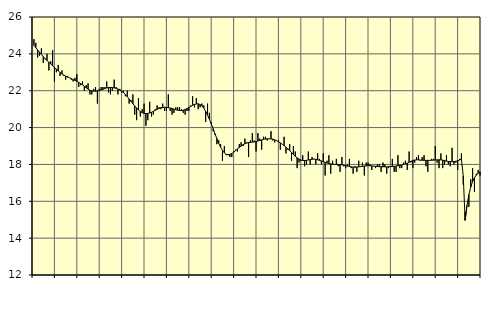
| Category | Tillverkning o utvinning, energi o miljö, SNI 05-33, 35-39 | Series 1 |
|---|---|---|
| nan | 24.8 | 24.46 |
| 1.0 | 24.6 | 24.34 |
| 1.0 | 23.8 | 24.21 |
| 1.0 | 23.9 | 24.09 |
| 1.0 | 24.3 | 23.97 |
| 1.0 | 23.5 | 23.85 |
| 1.0 | 23.7 | 23.74 |
| 1.0 | 24 | 23.64 |
| 1.0 | 23.1 | 23.54 |
| 1.0 | 23.6 | 23.45 |
| 1.0 | 24.2 | 23.35 |
| 1.0 | 22.5 | 23.26 |
| nan | 23 | 23.17 |
| 2.0 | 23.4 | 23.08 |
| 2.0 | 22.8 | 22.99 |
| 2.0 | 23.1 | 22.91 |
| 2.0 | 22.8 | 22.85 |
| 2.0 | 22.6 | 22.79 |
| 2.0 | 22.8 | 22.74 |
| 2.0 | 22.7 | 22.7 |
| 2.0 | 22.6 | 22.66 |
| 2.0 | 22.5 | 22.61 |
| 2.0 | 22.7 | 22.56 |
| 2.0 | 22.9 | 22.51 |
| nan | 22.2 | 22.45 |
| 3.0 | 22.3 | 22.39 |
| 3.0 | 22.5 | 22.32 |
| 3.0 | 22 | 22.24 |
| 3.0 | 22.3 | 22.16 |
| 3.0 | 22.4 | 22.09 |
| 3.0 | 21.8 | 22.03 |
| 3.0 | 21.8 | 21.99 |
| 3.0 | 22.1 | 21.98 |
| 3.0 | 22.2 | 21.97 |
| 3.0 | 21.3 | 21.99 |
| 3.0 | 22.1 | 22.01 |
| nan | 22.2 | 22.05 |
| 4.0 | 22.2 | 22.08 |
| 4.0 | 22.2 | 22.12 |
| 4.0 | 22.5 | 22.15 |
| 4.0 | 21.9 | 22.17 |
| 4.0 | 21.8 | 22.18 |
| 4.0 | 22 | 22.17 |
| 4.0 | 22.6 | 22.15 |
| 4.0 | 22.2 | 22.13 |
| 4.0 | 21.8 | 22.09 |
| 4.0 | 22.1 | 22.04 |
| 4.0 | 21.9 | 21.98 |
| nan | 22 | 21.89 |
| 5.0 | 21.7 | 21.79 |
| 5.0 | 22 | 21.68 |
| 5.0 | 21.3 | 21.55 |
| 5.0 | 21.5 | 21.42 |
| 5.0 | 21.8 | 21.29 |
| 5.0 | 20.7 | 21.17 |
| 5.0 | 20.4 | 21.06 |
| 5.0 | 21.6 | 20.96 |
| 5.0 | 20.6 | 20.87 |
| 5.0 | 21 | 20.81 |
| 5.0 | 21.3 | 20.77 |
| nan | 20.1 | 20.76 |
| 6.0 | 20.4 | 20.77 |
| 6.0 | 21.4 | 20.79 |
| 6.0 | 20.6 | 20.83 |
| 6.0 | 20.7 | 20.88 |
| 6.0 | 21 | 20.94 |
| 6.0 | 21.2 | 20.99 |
| 6.0 | 21.1 | 21.04 |
| 6.0 | 21 | 21.08 |
| 6.0 | 21.3 | 21.09 |
| 6.0 | 20.9 | 21.1 |
| 6.0 | 20.9 | 21.09 |
| nan | 21.8 | 21.08 |
| 7.0 | 20.9 | 21.06 |
| 7.0 | 20.7 | 21.04 |
| 7.0 | 20.8 | 21 |
| 7.0 | 21.1 | 20.97 |
| 7.0 | 21.1 | 20.94 |
| 7.0 | 21.1 | 20.93 |
| 7.0 | 21 | 20.92 |
| 7.0 | 20.8 | 20.94 |
| 7.0 | 20.7 | 20.98 |
| 7.0 | 20.9 | 21.03 |
| 7.0 | 20.9 | 21.09 |
| nan | 21.2 | 21.15 |
| 8.0 | 21.7 | 21.21 |
| 8.0 | 21.1 | 21.25 |
| 8.0 | 21.6 | 21.28 |
| 8.0 | 21 | 21.29 |
| 8.0 | 21.1 | 21.25 |
| 8.0 | 21.3 | 21.17 |
| 8.0 | 21.2 | 21.05 |
| 8.0 | 20.3 | 20.88 |
| 8.0 | 21.3 | 20.68 |
| 8.0 | 20.8 | 20.45 |
| 8.0 | 20.3 | 20.2 |
| nan | 19.8 | 19.94 |
| 9.0 | 19.6 | 19.66 |
| 9.0 | 19.1 | 19.4 |
| 9.0 | 19.3 | 19.15 |
| 9.0 | 19.1 | 18.93 |
| 9.0 | 18.2 | 18.76 |
| 9.0 | 19 | 18.63 |
| 9.0 | 18.5 | 18.55 |
| 9.0 | 18.5 | 18.53 |
| 9.0 | 18.4 | 18.55 |
| 9.0 | 18.4 | 18.59 |
| 9.0 | 18.7 | 18.66 |
| nan | 18.8 | 18.75 |
| 10.0 | 18.7 | 18.84 |
| 10.0 | 19.1 | 18.92 |
| 10.0 | 19.2 | 19 |
| 10.0 | 19 | 19.07 |
| 10.0 | 19.4 | 19.12 |
| 10.0 | 19.2 | 19.16 |
| 10.0 | 18.4 | 19.18 |
| 10.0 | 19.3 | 19.2 |
| 10.0 | 19.7 | 19.21 |
| 10.0 | 19.3 | 19.22 |
| 10.0 | 18.7 | 19.23 |
| nan | 19.7 | 19.27 |
| 11.0 | 19.4 | 19.3 |
| 11.0 | 18.8 | 19.33 |
| 11.0 | 19.5 | 19.36 |
| 11.0 | 19.5 | 19.38 |
| 11.0 | 19.3 | 19.39 |
| 11.0 | 19.4 | 19.39 |
| 11.0 | 19.8 | 19.39 |
| 11.0 | 19.3 | 19.37 |
| 11.0 | 19.2 | 19.33 |
| 11.0 | 19.3 | 19.29 |
| 11.0 | 19.3 | 19.23 |
| nan | 18.8 | 19.17 |
| 12.0 | 19.1 | 19.1 |
| 12.0 | 19.5 | 19.02 |
| 12.0 | 18.6 | 18.94 |
| 12.0 | 18.8 | 18.85 |
| 12.0 | 19.1 | 18.75 |
| 12.0 | 18.2 | 18.65 |
| 12.0 | 19 | 18.54 |
| 12.0 | 18.7 | 18.44 |
| 12.0 | 17.8 | 18.36 |
| 12.0 | 18.1 | 18.29 |
| 12.0 | 18.2 | 18.24 |
| nan | 18.5 | 18.21 |
| 13.0 | 17.9 | 18.21 |
| 13.0 | 18 | 18.22 |
| 13.0 | 18.7 | 18.24 |
| 13.0 | 18 | 18.26 |
| 13.0 | 18.4 | 18.28 |
| 13.0 | 18.3 | 18.29 |
| 13.0 | 18 | 18.28 |
| 13.0 | 18.6 | 18.25 |
| 13.0 | 18.3 | 18.22 |
| 13.0 | 18 | 18.19 |
| 13.0 | 18.6 | 18.15 |
| nan | 17.4 | 18.11 |
| 14.0 | 18.2 | 18.08 |
| 14.0 | 18.5 | 18.05 |
| 14.0 | 17.5 | 18.03 |
| 14.0 | 18.2 | 18.01 |
| 14.0 | 18 | 18 |
| 14.0 | 18.3 | 18 |
| 14.0 | 17.9 | 18 |
| 14.0 | 17.6 | 17.99 |
| 14.0 | 18.4 | 17.98 |
| 14.0 | 17.9 | 17.96 |
| 14.0 | 17.8 | 17.94 |
| nan | 18 | 17.91 |
| 15.0 | 18.3 | 17.89 |
| 15.0 | 17.8 | 17.87 |
| 15.0 | 17.5 | 17.86 |
| 15.0 | 17.9 | 17.85 |
| 15.0 | 17.6 | 17.86 |
| 15.0 | 18.2 | 17.87 |
| 15.0 | 17.9 | 17.88 |
| 15.0 | 18.1 | 17.9 |
| 15.0 | 17.4 | 17.91 |
| 15.0 | 18.1 | 17.92 |
| 15.0 | 18.1 | 17.93 |
| nan | 18 | 17.93 |
| 16.0 | 17.7 | 17.92 |
| 16.0 | 17.9 | 17.91 |
| 16.0 | 17.8 | 17.9 |
| 16.0 | 18 | 17.89 |
| 16.0 | 18 | 17.88 |
| 16.0 | 17.6 | 17.88 |
| 16.0 | 18.1 | 17.87 |
| 16.0 | 18 | 17.87 |
| 16.0 | 17.5 | 17.87 |
| 16.0 | 17.8 | 17.88 |
| 16.0 | 17.9 | 17.88 |
| nan | 18.3 | 17.89 |
| 17.0 | 17.6 | 17.9 |
| 17.0 | 17.6 | 17.91 |
| 17.0 | 18.5 | 17.93 |
| 17.0 | 17.8 | 17.95 |
| 17.0 | 17.8 | 17.97 |
| 17.0 | 18.1 | 18 |
| 17.0 | 18.2 | 18.03 |
| 17.0 | 17.7 | 18.07 |
| 17.0 | 18.7 | 18.12 |
| 17.0 | 18.1 | 18.17 |
| 17.0 | 17.8 | 18.22 |
| nan | 18.1 | 18.24 |
| 18.0 | 18.4 | 18.25 |
| 18.0 | 18.5 | 18.25 |
| 18.0 | 18.2 | 18.24 |
| 18.0 | 18.4 | 18.23 |
| 18.0 | 18.5 | 18.22 |
| 18.0 | 17.9 | 18.22 |
| 18.0 | 17.6 | 18.22 |
| 18.0 | 18.2 | 18.22 |
| 18.0 | 18.3 | 18.23 |
| 18.0 | 18.3 | 18.23 |
| 18.0 | 19 | 18.24 |
| nan | 18.1 | 18.25 |
| 19.0 | 17.8 | 18.25 |
| 19.0 | 18.6 | 18.25 |
| 19.0 | 17.8 | 18.23 |
| 19.0 | 18 | 18.21 |
| 19.0 | 18.5 | 18.18 |
| 19.0 | 18 | 18.16 |
| 19.0 | 17.9 | 18.15 |
| 19.0 | 18.9 | 18.15 |
| 19.0 | 18 | 18.15 |
| 19.0 | 18.1 | 18.17 |
| 19.0 | 17.7 | 18.2 |
| nan | 18.3 | 18.24 |
| 20.0 | 18.6 | 18.29 |
| 20.0 | 16.9 | 17.36 |
| 20.0 | 15.4 | 14.97 |
| 20.0 | 15.8 | 15.78 |
| 20.0 | 15.7 | 16.36 |
| 20.0 | 17.2 | 16.77 |
| 20.0 | 17.8 | 17.07 |
| 20.0 | 16.5 | 17.28 |
| 20.0 | 17.5 | 17.42 |
| 20.0 | 17.7 | 17.52 |
| 20.0 | 17.4 | 17.59 |